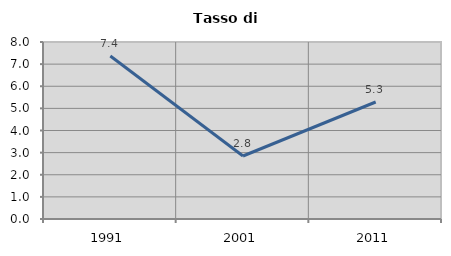
| Category | Tasso di disoccupazione   |
|---|---|
| 1991.0 | 7.367 |
| 2001.0 | 2.848 |
| 2011.0 | 5.288 |